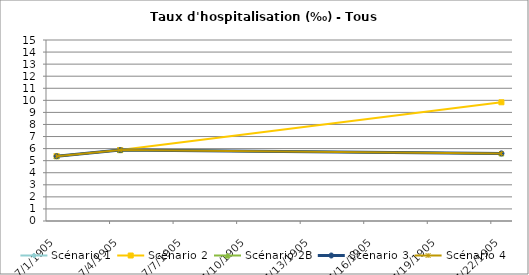
| Category | Scénario 1 | Scénario 2 | Scénario 2B | Scénario 3 | Scénario 4 |
|---|---|---|---|---|---|
| 2009.0 | 5.371 | 5.371 | 5.371 | 5.371 | 5.371 |
| 2012.0 | 5.875 | 5.875 | 5.875 | 5.875 | 5.875 |
| 2030.0 | 5.599 | 9.839 | 5.599 | 5.599 | 5.599 |